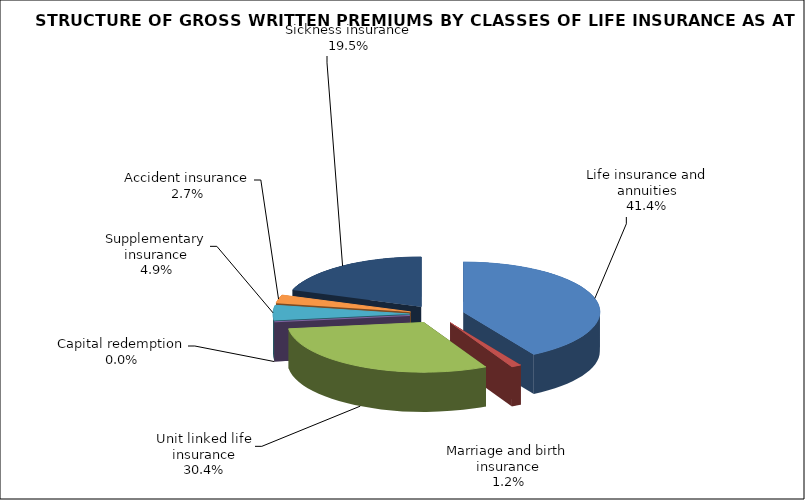
| Category | Series 0 |
|---|---|
| Life insurance and annuities | 22897092.39 |
| Marriage and birth insurance | 650805.307 |
| Unit linked life insurance | 16846899.917 |
| Capital redemption | 0 |
| Supplementary insurance | 2690266.071 |
| Accident insurance | 1478218.81 |
| Sickness insurance | 10805462.42 |